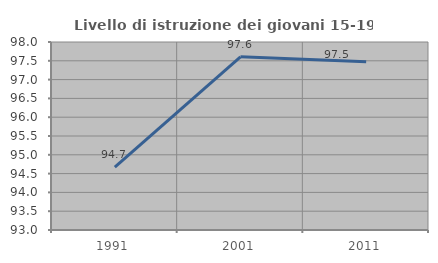
| Category | Livello di istruzione dei giovani 15-19 anni |
|---|---|
| 1991.0 | 94.672 |
| 2001.0 | 97.606 |
| 2011.0 | 97.472 |